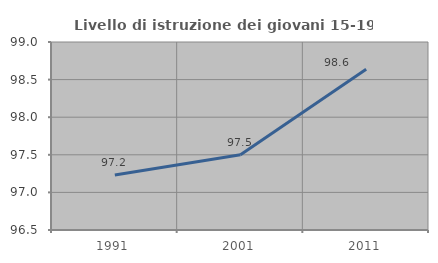
| Category | Livello di istruzione dei giovani 15-19 anni |
|---|---|
| 1991.0 | 97.232 |
| 2001.0 | 97.5 |
| 2011.0 | 98.636 |